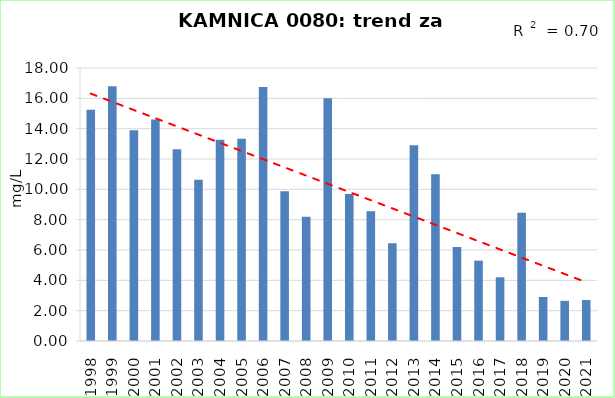
| Category | Vsota |
|---|---|
| 1998 | 15.25 |
| 1999 | 16.8 |
| 2000 | 13.9 |
| 2001 | 14.6 |
| 2002 | 12.65 |
| 2003 | 10.625 |
| 2004 | 13.267 |
| 2005 | 13.333 |
| 2006 | 16.75 |
| 2007 | 9.875 |
| 2008 | 8.2 |
| 2009 | 16 |
| 2010 | 9.7 |
| 2011 | 8.55 |
| 2012 | 6.45 |
| 2013 | 12.9 |
| 2014 | 11 |
| 2015 | 6.2 |
| 2016 | 5.3 |
| 2017 | 4.2 |
| 2018 | 8.45 |
| 2019 | 2.9 |
| 2020 | 2.65 |
| 2021 | 2.7 |